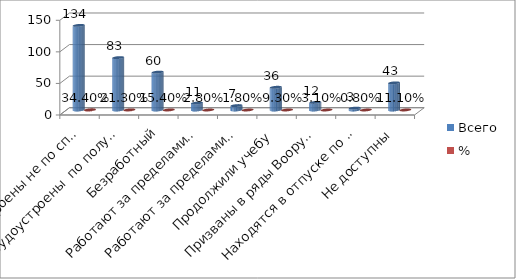
| Category | Всего | % |
|---|---|---|
| Трудоустроены не по специальности | 134 | 0.344 |
| Трудоустроены  по полученной специальности | 83 | 0.213 |
| Безработный | 60 | 0.154 |
| Работают за пределами Чувашии по специальности | 11 | 0.028 |
| Работают за пределами Чувашии не по специальности | 7 | 0.018 |
| Продолжили учебу | 36 | 0.093 |
| Призваны в ряды Вооруженных Сил РФ | 12 | 0.031 |
| Находятся в отпуске по уходу за ребенком | 3 | 0.008 |
| Не доступны | 43 | 0.111 |